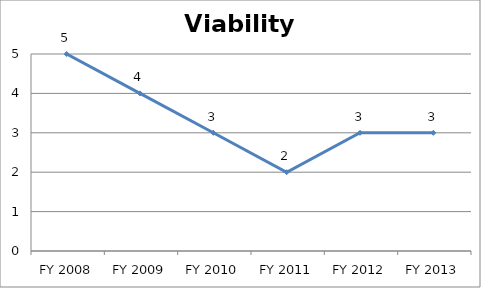
| Category | Viability score |
|---|---|
| FY 2013 | 3 |
| FY 2012 | 3 |
| FY 2011 | 2 |
| FY 2010 | 3 |
| FY 2009 | 4 |
| FY 2008 | 5 |